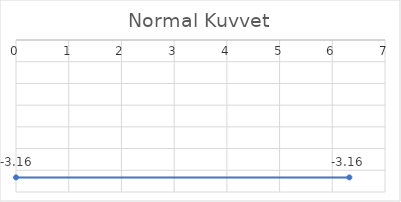
| Category | Series 0 |
|---|---|
| 0.0 | -3.164 |
| 6.324555320336759 | -3.164 |